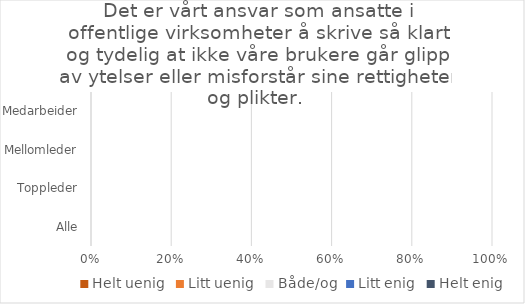
| Category | Helt uenig | Litt uenig | Både/og | Litt enig | Helt enig |
|---|---|---|---|---|---|
| Alle | 0 | 0 | 0 | 0 | 0 |
| Toppleder | 0 | 0 | 0 | 0 | 0 |
| Mellomleder | 0 | 0 | 0 | 0 | 0 |
| Medarbeider | 0 | 0 | 0 | 0 | 0 |